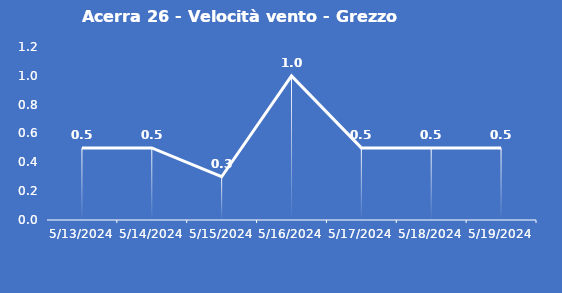
| Category | Acerra 26 - Velocità vento - Grezzo (m/s) |
|---|---|
| 5/13/24 | 0.5 |
| 5/14/24 | 0.5 |
| 5/15/24 | 0.3 |
| 5/16/24 | 1 |
| 5/17/24 | 0.5 |
| 5/18/24 | 0.5 |
| 5/19/24 | 0.5 |